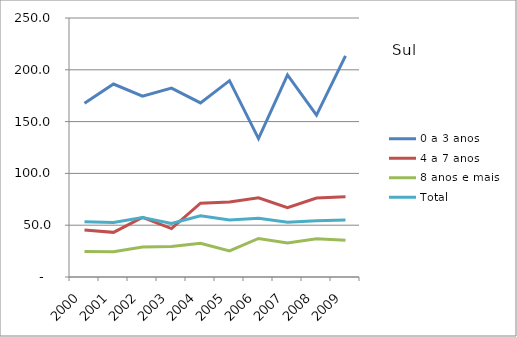
| Category | 0 a 3 anos | 4 a 7 anos | 8 anos e mais | Total |
|---|---|---|---|---|
| 2000.0 | 167.6 | 45.3 | 24.7 | 53.4 |
| 2001.0 | 186.3 | 43.1 | 24.3 | 52.6 |
| 2002.0 | 174.6 | 57.6 | 28.9 | 57.4 |
| 2003.0 | 182.3 | 46.7 | 29.5 | 51.6 |
| 2004.0 | 168 | 71.3 | 32.6 | 59 |
| 2005.0 | 189.5 | 72.4 | 25.1 | 55.1 |
| 2006.0 | 133.6 | 76.5 | 37.2 | 56.7 |
| 2007.0 | 195.1 | 66.9 | 32.9 | 52.9 |
| 2008.0 | 156.2 | 76.2 | 36.8 | 54.4 |
| 2009.0 | 213.4 | 77.5 | 35.4 | 54.9 |